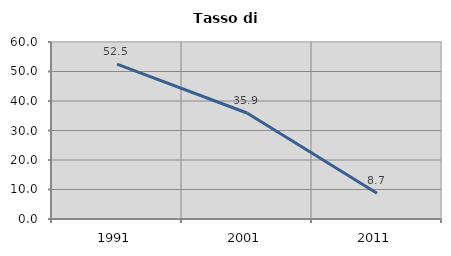
| Category | Tasso di disoccupazione   |
|---|---|
| 1991.0 | 52.508 |
| 2001.0 | 35.938 |
| 2011.0 | 8.696 |